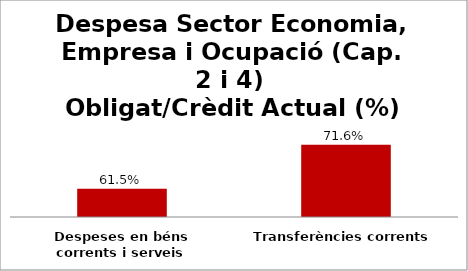
| Category | Series 0 |
|---|---|
| Despeses en béns corrents i serveis | 0.615 |
| Transferències corrents | 0.716 |